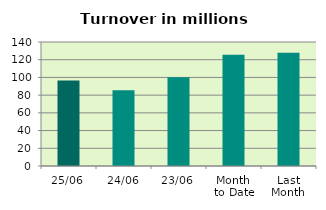
| Category | Series 0 |
|---|---|
| 25/06 | 96.641 |
| 24/06 | 85.505 |
| 23/06 | 100.312 |
| Month 
to Date | 125.538 |
| Last
Month | 127.932 |